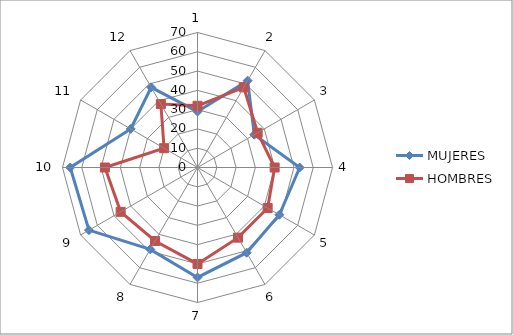
| Category | MUJERES | HOMBRES |
|---|---|---|
| 0 | 29 | 32 |
| 1 | 52 | 48 |
| 2 | 34 | 36 |
| 3 | 53 | 40 |
| 4 | 49 | 42 |
| 5 | 51 | 42 |
| 6 | 57 | 50 |
| 7 | 49 | 44 |
| 8 | 65 | 46 |
| 9 | 66 | 48 |
| 10 | 40 | 20 |
| 11 | 48 | 38 |